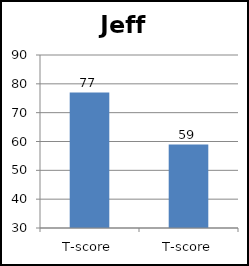
| Category | Jeff |
|---|---|
| T-score | 77 |
| T-score | 59 |